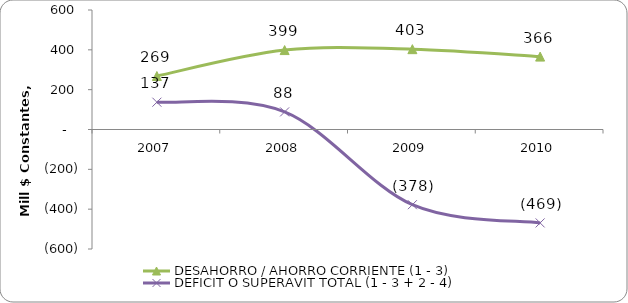
| Category | DESAHORRO / AHORRO CORRIENTE (1 - 3) | DEFICIT O SUPERAVIT TOTAL (1 - 3 + 2 - 4) |
|---|---|---|
| 2007 | 268.532 | 137.099 |
| 2008 | 398.835 | 88.396 |
| 2009 | 403.395 | -377.602 |
| 2010 | 366 | -469 |